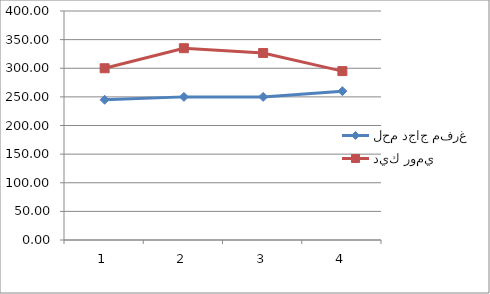
| Category | لحم دجاج مفرغ | ديك رومي |
|---|---|---|
| 0 | 245 | 300 |
| 1 | 250 | 335 |
| 2 | 250 | 326.67 |
| 3 | 260 | 295 |